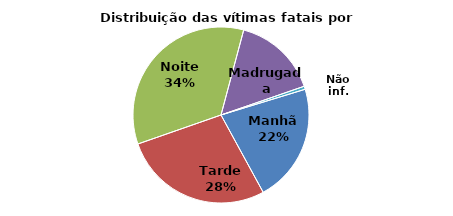
| Category | Series 0 |
|---|---|
| Manhã | 455 |
| Tarde | 577 |
| Noite | 721 |
| Madrugada | 325 |
| Não inf. | 12 |